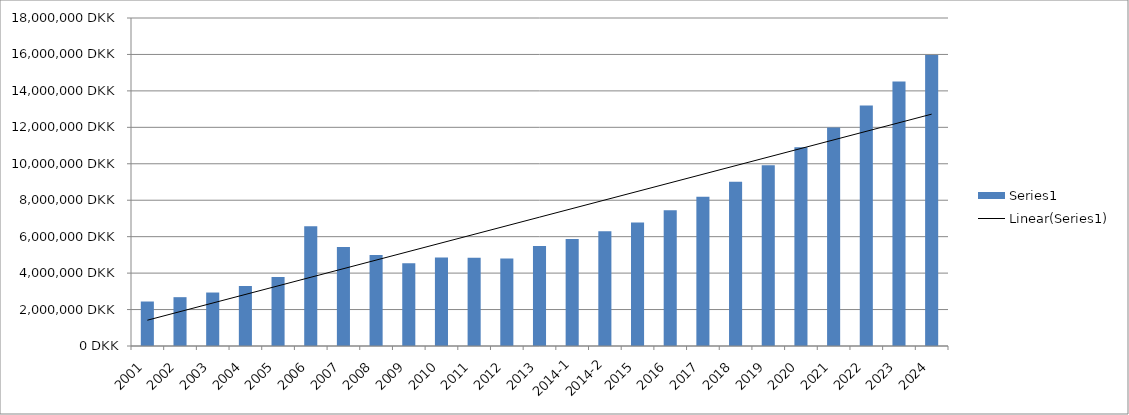
| Category | Series 0 |
|---|---|
| 2001 | 2441517.333 |
| 2002 | 2679396.444 |
| 2003 | 2934728.889 |
| 2004 | 3291608 |
| 2005 | 3782976 |
| 2006 | 6566533.333 |
| 2007 | 5437909 |
| 2008 | 4997425.778 |
| 2009 | 4543406.4 |
| 2010 | 4859748.444 |
| 2011 | 4843624.889 |
| 2012 | 4797318.4 |
| 2013 | 5489631.5 |
| 2014-1 | 5865657.333 |
| 2014-2 | 6296664 |
| 2015 | 6770789.469 |
| 2016 | 7447868.416 |
| 2017 | 8192655.257 |
| 2018 | 9011920.783 |
| 2019 | 9913112.861 |
| 2020 | 10904424.147 |
| 2021 | 11994866.562 |
| 2022 | 13194353.218 |
| 2023 | 14513788.54 |
| 2024 | 15965167.394 |